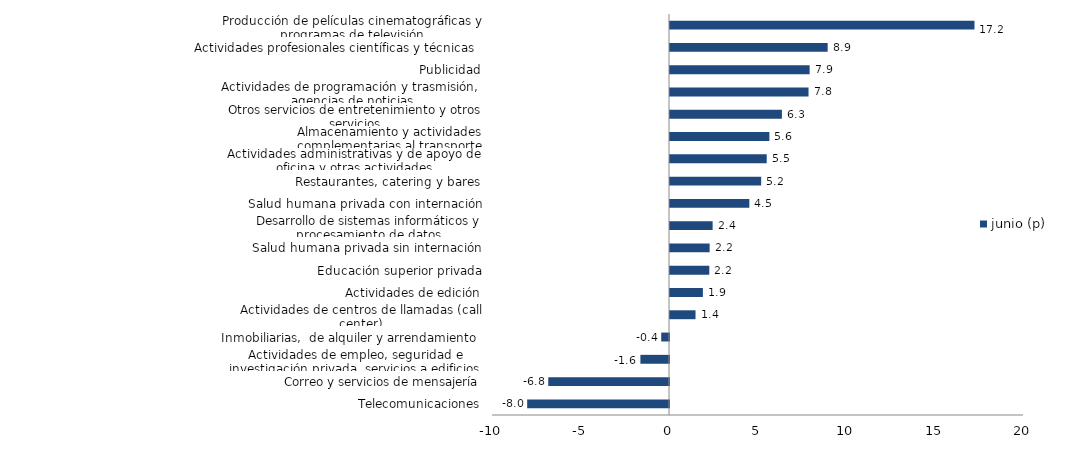
| Category | junio (p) |
|---|---|
| Telecomunicaciones | -8.013 |
| Correo y servicios de mensajería | -6.821 |
| Actividades de empleo, seguridad e investigación privada, servicios a edificios | -1.617 |
| Inmobiliarias,  de alquiler y arrendamiento  | -0.439 |
| Actividades de centros de llamadas (call center) | 1.443 |
| Actividades de edición | 1.858 |
| Educación superior privada | 2.221 |
| Salud humana privada sin internación | 2.24 |
| Desarrollo de sistemas informáticos y procesamiento de datos | 2.409 |
| Salud humana privada con internación | 4.483 |
| Restaurantes, catering y bares | 5.152 |
| Actividades administrativas y de apoyo de oficina y otras actividades | 5.464 |
| Almacenamiento y actividades complementarias al transporte | 5.615 |
| Otros servicios de entretenimiento y otros servicios | 6.322 |
| Actividades de programación y trasmisión,  agencias de noticias | 7.827 |
| Publicidad | 7.889 |
| Actividades profesionales científicas y técnicas  | 8.908 |
| Producción de películas cinematográficas y programas de televisión | 17.203 |